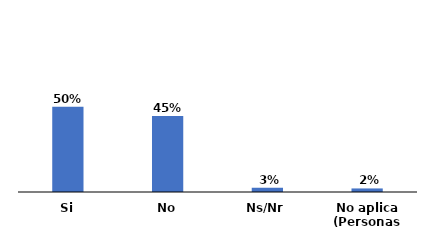
| Category | Series 0 |
|---|---|
| Si | 0.504 |
| No | 0.45 |
| Ns/Nr | 0.026 |
| No aplica (Personas que no asisten) | 0.021 |